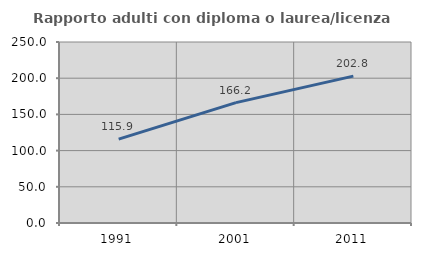
| Category | Rapporto adulti con diploma o laurea/licenza media  |
|---|---|
| 1991.0 | 115.9 |
| 2001.0 | 166.23 |
| 2011.0 | 202.841 |